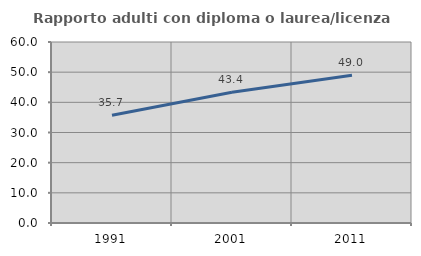
| Category | Rapporto adulti con diploma o laurea/licenza media  |
|---|---|
| 1991.0 | 35.688 |
| 2001.0 | 43.353 |
| 2011.0 | 48.98 |